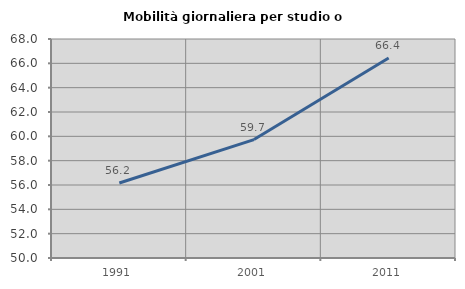
| Category | Mobilità giornaliera per studio o lavoro |
|---|---|
| 1991.0 | 56.163 |
| 2001.0 | 59.733 |
| 2011.0 | 66.439 |